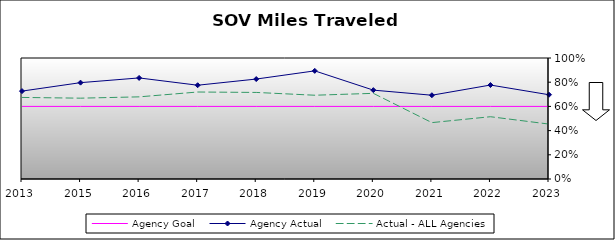
| Category | Agency Goal | Agency Actual | Actual - ALL Agencies |
|---|---|---|---|
| 2013.0 | 0.6 | 0.726 | 0.674 |
| 2015.0 | 0.6 | 0.796 | 0.668 |
| 2016.0 | 0.6 | 0.835 | 0.679 |
| 2017.0 | 0.6 | 0.775 | 0.719 |
| 2018.0 | 0.6 | 0.826 | 0.715 |
| 2019.0 | 0.6 | 0.894 | 0.692 |
| 2020.0 | 0.6 | 0.734 | 0.708 |
| 2021.0 | 0.6 | 0.692 | 0.466 |
| 2022.0 | 0.6 | 0.776 | 0.515 |
| 2023.0 | 0.6 | 0.696 | 0.454 |